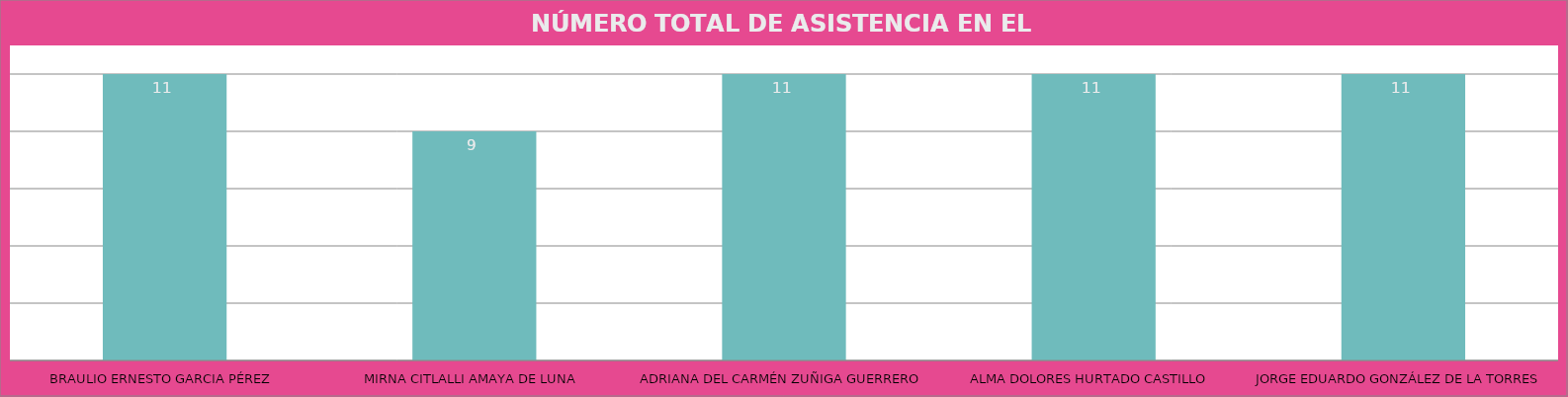
| Category | BRAULIO ERNESTO GARCIA PÉREZ |
|---|---|
| BRAULIO ERNESTO GARCIA PÉREZ | 11 |
| MIRNA CITLALLI AMAYA DE LUNA | 9 |
| ADRIANA DEL CARMÉN ZUÑIGA GUERRERO | 11 |
| ALMA DOLORES HURTADO CASTILLO | 11 |
| JORGE EDUARDO GONZÁLEZ DE LA TORRES | 11 |